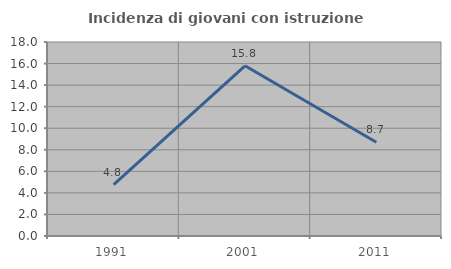
| Category | Incidenza di giovani con istruzione universitaria |
|---|---|
| 1991.0 | 4.762 |
| 2001.0 | 15.789 |
| 2011.0 | 8.696 |